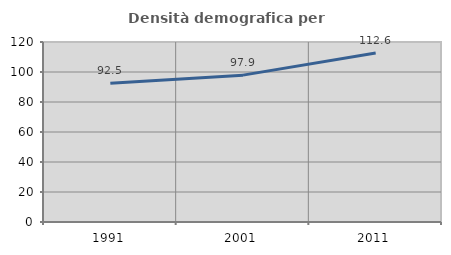
| Category | Densità demografica |
|---|---|
| 1991.0 | 92.531 |
| 2001.0 | 97.909 |
| 2011.0 | 112.617 |